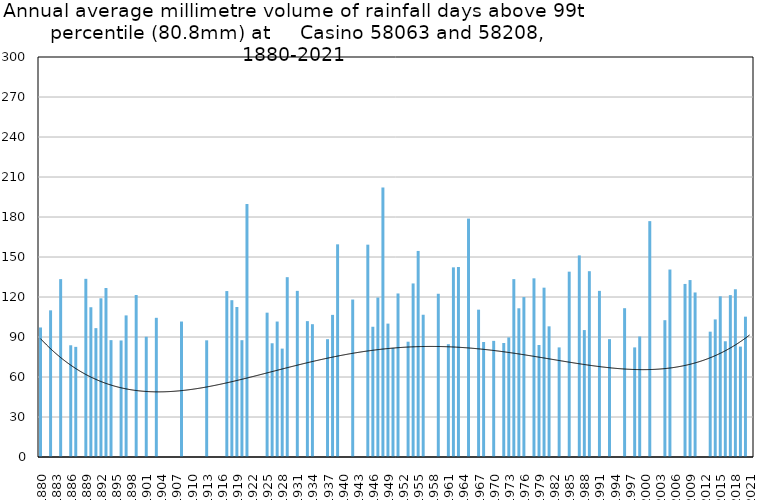
| Category | Annual average mm in days above 99th percentile |
|---|---|
| 1880 | 97.15 |
| 1881 | 0 |
| 1882 | 110 |
| 1883 | 0 |
| 1884 | 133.4 |
| 1885 | 0 |
| 1886 | 83.8 |
| 1887 | 82.6 |
| 1888 | 0 |
| 1889 | 133.633 |
| 1890 | 112.325 |
| 1891 | 96.65 |
| 1892 | 119.033 |
| 1893 | 126.733 |
| 1894 | 87.65 |
| 1895 | 0 |
| 1896 | 87.4 |
| 1897 | 106.2 |
| 1898 | 0 |
| 1899 | 121.5 |
| 1900 | 0 |
| 1901 | 90.2 |
| 1902 | 0 |
| 1903 | 104.4 |
| 1904 | 0 |
| 1905 | 0 |
| 1906 | 0 |
| 1907 | 0 |
| 1908 | 101.6 |
| 1909 | 0 |
| 1910 | 0 |
| 1911 | 0 |
| 1912 | 0 |
| 1913 | 87.5 |
| 1914 | 0 |
| 1915 | 0 |
| 1916 | 0 |
| 1917 | 124.45 |
| 1918 | 117.6 |
| 1919 | 112.5 |
| 1920 | 87.6 |
| 1921 | 189.733 |
| 1922 | 0 |
| 1923 | 0 |
| 1924 | 0 |
| 1925 | 108.25 |
| 1926 | 85.3 |
| 1927 | 101.6 |
| 1928 | 81.3 |
| 1929 | 134.867 |
| 1930 | 0 |
| 1931 | 124.6 |
| 1932 | 0 |
| 1933 | 101.9 |
| 1934 | 99.6 |
| 1935 | 0 |
| 1936 | 0 |
| 1937 | 88.367 |
| 1938 | 106.6 |
| 1939 | 159.5 |
| 1940 | 0 |
| 1941 | 0 |
| 1942 | 118.1 |
| 1943 | 0 |
| 1944 | 0 |
| 1945 | 159.25 |
| 1946 | 97.68 |
| 1947 | 119.6 |
| 1948 | 202.2 |
| 1949 | 100.05 |
| 1950 | 81.8 |
| 1951 | 122.65 |
| 1952 | 0 |
| 1953 | 86.475 |
| 1954 | 130.175 |
| 1955 | 154.55 |
| 1956 | 106.7 |
| 1957 | 0 |
| 1958 | 0 |
| 1959 | 122.433 |
| 1960 | 0 |
| 1961 | 84.6 |
| 1962 | 142.233 |
| 1963 | 142.5 |
| 1964 | 0 |
| 1965 | 178.8 |
| 1966 | 0 |
| 1967 | 110.5 |
| 1968 | 86.25 |
| 1969 | 0 |
| 1970 | 87.1 |
| 1971 | 0 |
| 1972 | 85.5 |
| 1973 | 89.7 |
| 1974 | 133.4 |
| 1975 | 111.533 |
| 1976 | 119.95 |
| 1977 | 0 |
| 1978 | 134 |
| 1979 | 84 |
| 1980 | 127 |
| 1981 | 98 |
| 1982 | 0 |
| 1983 | 82.2 |
| 1984 | 0 |
| 1985 | 139 |
| 1986 | 0 |
| 1987 | 151.2 |
| 1988 | 95.2 |
| 1989 | 139.35 |
| 1990 | 0 |
| 1991 | 124.6 |
| 1992 | 0 |
| 1993 | 88.4 |
| 1994 | 0 |
| 1995 | 0 |
| 1996 | 111.6 |
| 1997 | 0 |
| 1998 | 82.2 |
| 1999 | 90.4 |
| 2000 | 0 |
| 2001 | 176.9 |
| 2002 | 0 |
| 2003 | 0 |
| 2004 | 102.6 |
| 2005 | 140.6 |
| 2006 | 0 |
| 2007 | 0 |
| 2008 | 129.8 |
| 2009 | 132.7 |
| 2010 | 123.4 |
| 2011 | 0 |
| 2012 | 0 |
| 2013 | 94 |
| 2014 | 103.2 |
| 2015 | 120.5 |
| 2016 | 86.8 |
| 2017 | 121.4 |
| 2018 | 125.8 |
| 2019 | 82.8 |
| 2020 | 105.25 |
| 2021 | 0 |